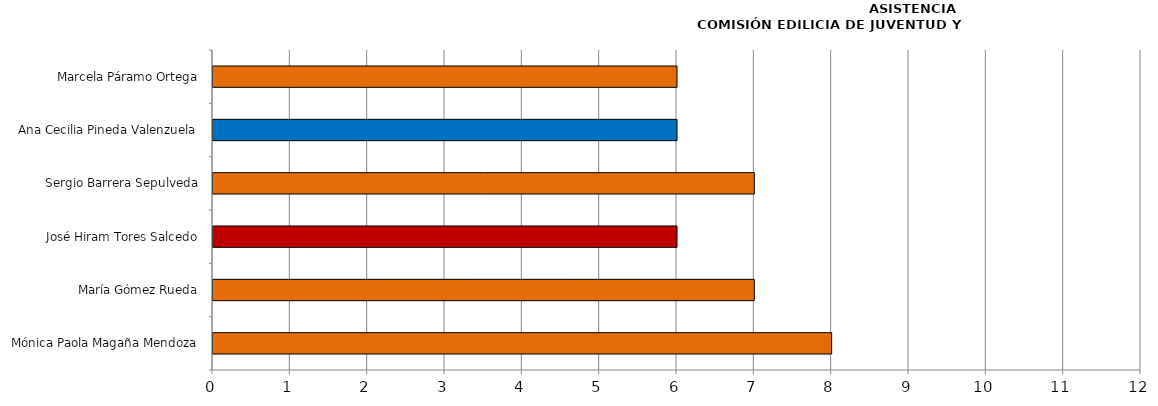
| Category | Series 0 |
|---|---|
| Mónica Paola Magaña Mendoza | 8 |
| María Gómez Rueda | 7 |
| José Hiram Tores Salcedo | 6 |
| Sergio Barrera Sepulveda | 7 |
| Ana Cecilia Pineda Valenzuela | 6 |
| Marcela Páramo Ortega | 6 |